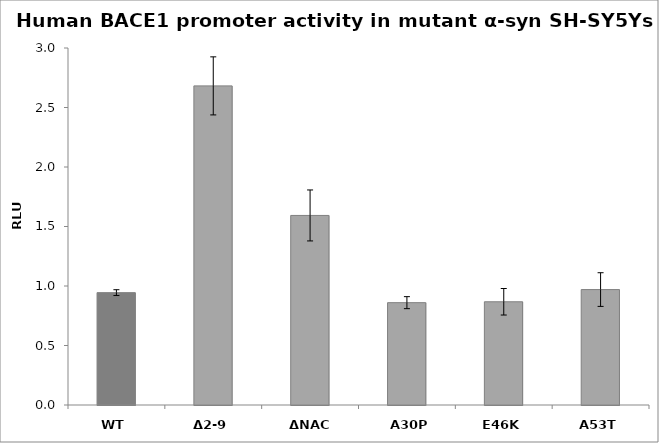
| Category | Series 0 |
|---|---|
| WT | 0.944 |
| Δ2-9 | 2.682 |
| ΔNAC | 1.593 |
| A30P | 0.86 |
| E46K | 0.867 |
| A53T | 0.97 |